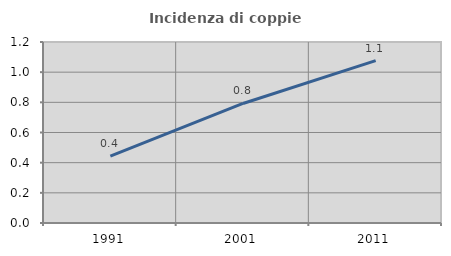
| Category | Incidenza di coppie miste |
|---|---|
| 1991.0 | 0.443 |
| 2001.0 | 0.792 |
| 2011.0 | 1.076 |